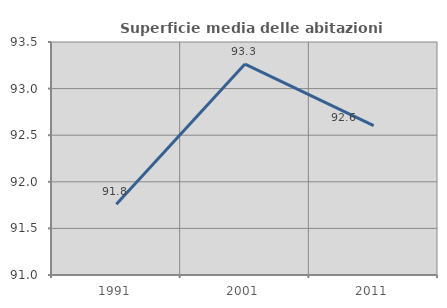
| Category | Superficie media delle abitazioni occupate |
|---|---|
| 1991.0 | 91.759 |
| 2001.0 | 93.263 |
| 2011.0 | 92.604 |